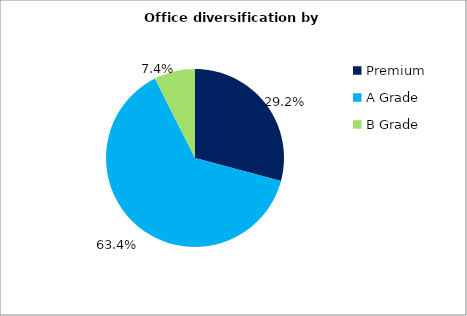
| Category | Series 0 |
|---|---|
| Premium | 0.292 |
| A Grade | 0.634 |
| B Grade | 0.074 |